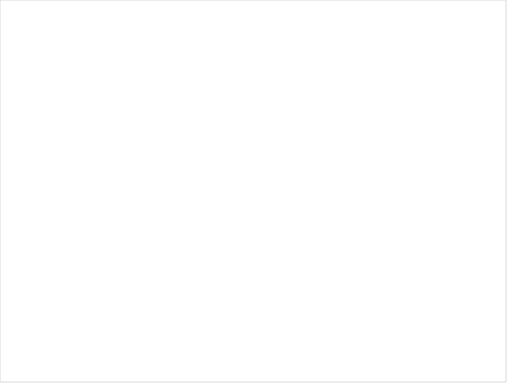
| Category | Series 0 |
|---|---|
| Puntaje alcanzado | 0 |
| Puntaje no alcanzado | 100 |